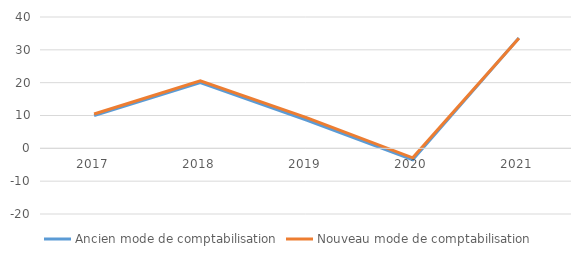
| Category | Ancien mode de comptabilisation | Nouveau mode de comptabilisation |
|---|---|---|
| 2017.0 | 10.015 | 10.453 |
| 2018.0 | 19.999 | 20.59 |
| 2019.0 | 8.64 | 9.375 |
| 2020.0 | -3.449 | -2.899 |
| 2021.0 | 33.615 | 33.527 |